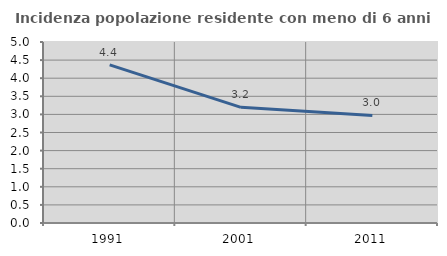
| Category | Incidenza popolazione residente con meno di 6 anni |
|---|---|
| 1991.0 | 4.369 |
| 2001.0 | 3.195 |
| 2011.0 | 2.97 |